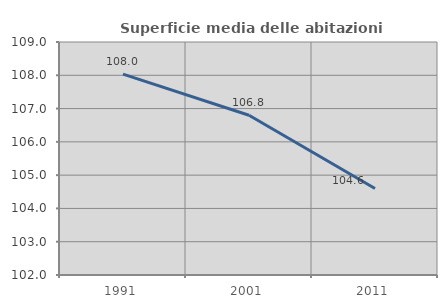
| Category | Superficie media delle abitazioni occupate |
|---|---|
| 1991.0 | 108.036 |
| 2001.0 | 106.798 |
| 2011.0 | 104.598 |